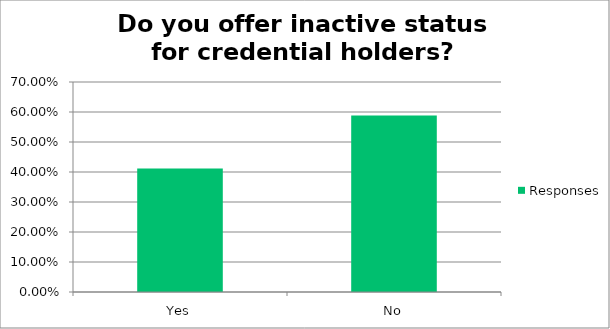
| Category | Responses |
|---|---|
| Yes | 0.412 |
| No | 0.588 |